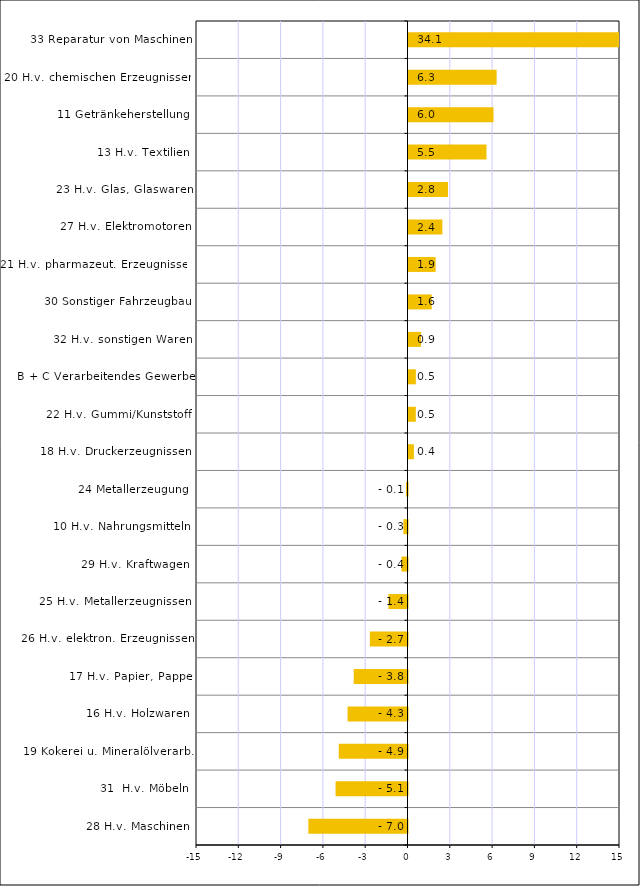
| Category | Series 0 |
|---|---|
| 28 H.v. Maschinen | -7.032 |
| 31  H.v. Möbeln | -5.102 |
| 19 Kokerei u. Mineralölverarb. | -4.875 |
| 16 H.v. Holzwaren | -4.25 |
| 17 H.v. Papier, Pappe | -3.813 |
| 26 H.v. elektron. Erzeugnissen | -2.67 |
| 25 H.v. Metallerzeugnissen | -1.352 |
| 29 H.v. Kraftwagen | -0.43 |
| 10 H.v. Nahrungsmitteln | -0.29 |
| 24 Metallerzeugung | -0.107 |
| 18 H.v. Druckerzeugnissen | 0.381 |
| 22 H.v. Gummi/Kunststoff | 0.519 |
| B + C Verarbeitendes Gewerbe | 0.521 |
| 32 H.v. sonstigen Waren | 0.885 |
| 30 Sonstiger Fahrzeugbau | 1.644 |
| 21 H.v. pharmazeut. Erzeugnissen | 1.924 |
| 27 H.v. Elektromotoren | 2.402 |
| 23 H.v. Glas, Glaswaren | 2.8 |
| 13 H.v. Textilien | 5.53 |
| 11 Getränkeherstellung | 6.029 |
| 20 H.v. chemischen Erzeugnissen | 6.25 |
| 33 Reparatur von Maschinen | 34.066 |